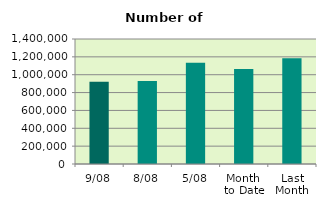
| Category | Series 0 |
|---|---|
| 9/08 | 921896 |
| 8/08 | 928676 |
| 5/08 | 1132974 |
| Month 
to Date | 1064838 |
| Last
Month | 1183989.81 |